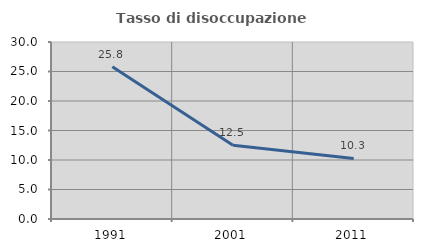
| Category | Tasso di disoccupazione giovanile  |
|---|---|
| 1991.0 | 25.806 |
| 2001.0 | 12.5 |
| 2011.0 | 10.256 |